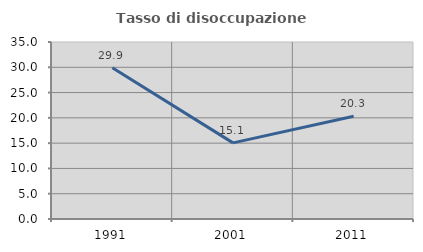
| Category | Tasso di disoccupazione giovanile  |
|---|---|
| 1991.0 | 29.902 |
| 2001.0 | 15.054 |
| 2011.0 | 20.312 |